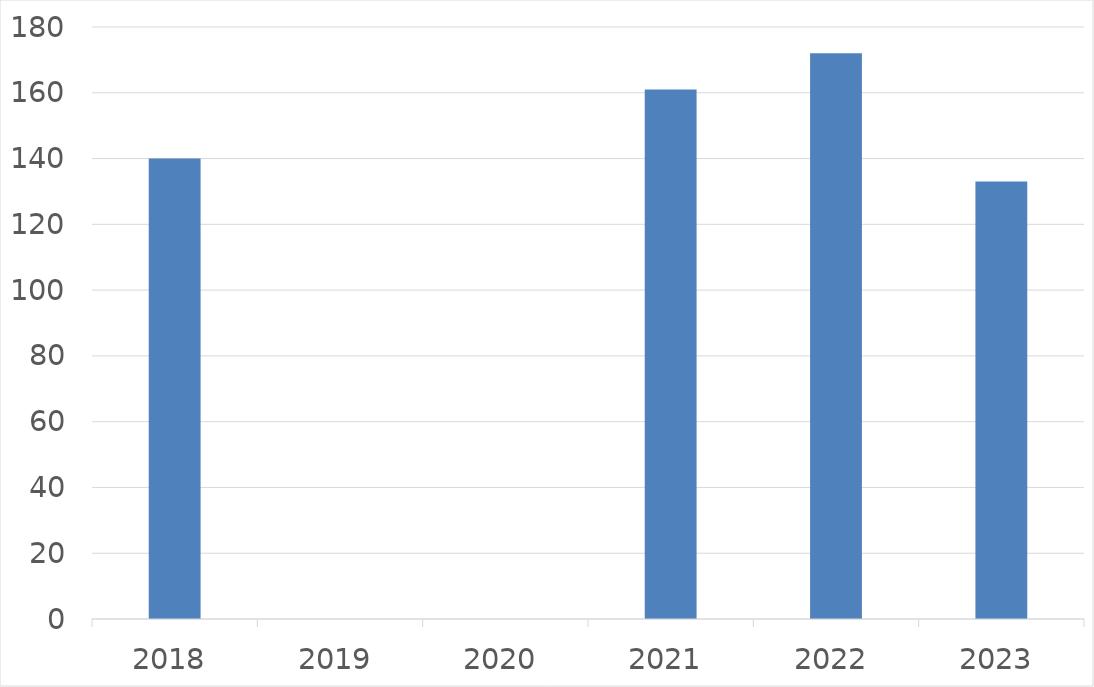
| Category | Series 0 |
|---|---|
| 2018 | 140 |
| 2019 | 0 |
| 2020 | 0 |
| 2021 | 161 |
| 2022 | 172 |
| 2023 | 133 |